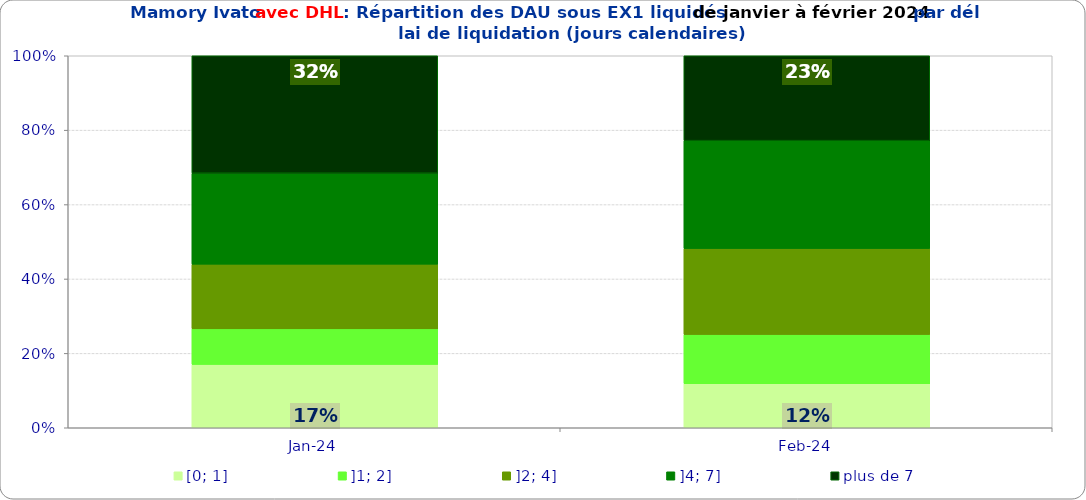
| Category | [0; 1] | ]1; 2] | ]2; 4] | ]4; 7] | plus de 7 |
|---|---|---|---|---|---|
| 2024-01-01 | 0.17 | 0.096 | 0.174 | 0.245 | 0.316 |
| 2024-02-01 | 0.118 | 0.132 | 0.231 | 0.29 | 0.228 |